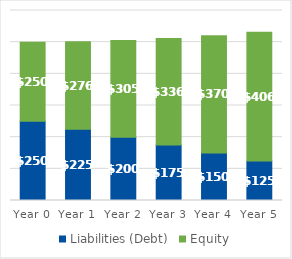
| Category | Liabilities (Debt) | Equity |
|---|---|---|
| 0.0 | 250 | 250 |
| 1.0 | 225 | 276.25 |
| 2.0 | 200 | 305 |
| 3.0 | 175 | 336.25 |
| 4.0 | 150 | 370 |
| 5.0 | 125 | 406.25 |